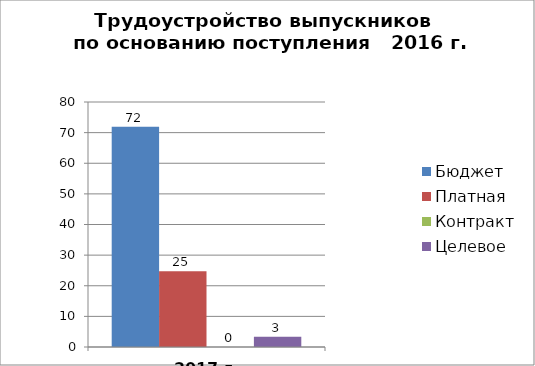
| Category | Бюджет | Платная | Контракт | Целевое |
|---|---|---|---|---|
| 2017 г. (%) | 71.91 | 24.719 | 0 | 3.371 |